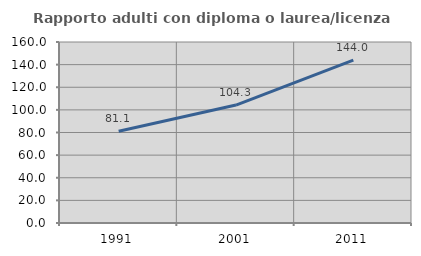
| Category | Rapporto adulti con diploma o laurea/licenza media  |
|---|---|
| 1991.0 | 81.068 |
| 2001.0 | 104.279 |
| 2011.0 | 144.03 |